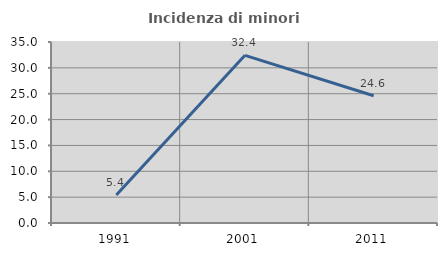
| Category | Incidenza di minori stranieri |
|---|---|
| 1991.0 | 5.405 |
| 2001.0 | 32.422 |
| 2011.0 | 24.596 |